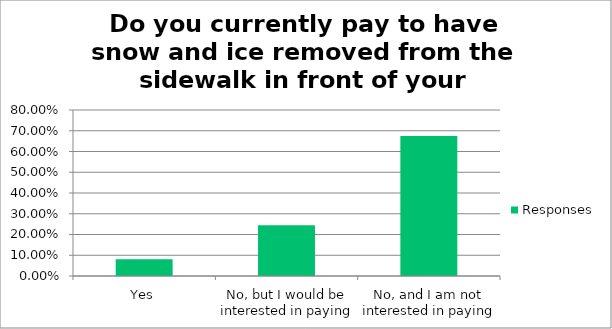
| Category | Responses |
|---|---|
| Yes | 0.08 |
| No, but I would be interested in paying | 0.244 |
| No, and I am not interested in paying | 0.675 |